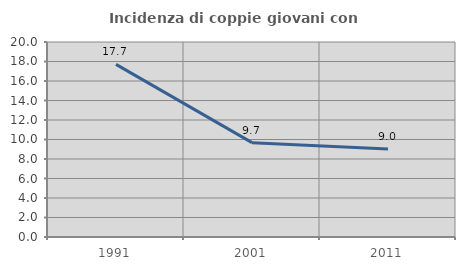
| Category | Incidenza di coppie giovani con figli |
|---|---|
| 1991.0 | 17.703 |
| 2001.0 | 9.677 |
| 2011.0 | 9.032 |